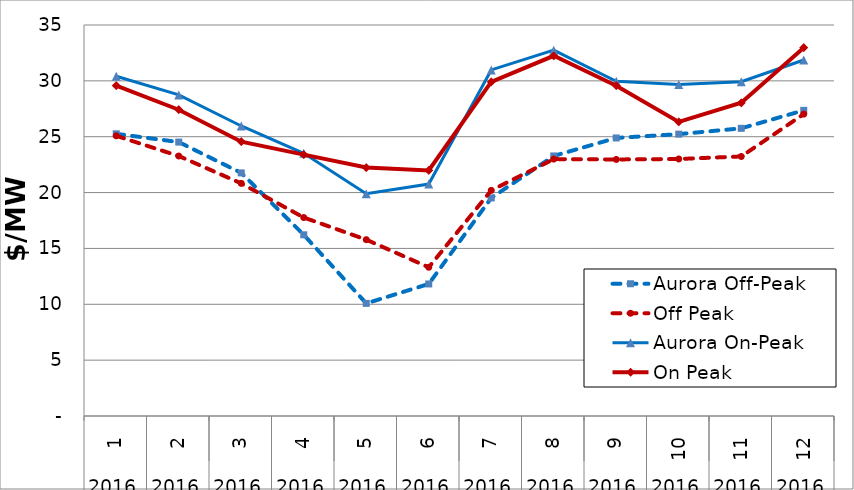
| Category | Aurora Off-Peak | Off Peak | Aurora On-Peak | On Peak |
|---|---|---|---|---|
| 0 | 25.26 | 25.08 | 30.41 | 29.564 |
| 1 | 24.52 | 23.272 | 28.74 | 27.416 |
| 2 | 21.76 | 20.823 | 25.96 | 24.552 |
| 3 | 16.22 | 17.768 | 23.51 | 23.394 |
| 4 | 10.08 | 15.785 | 19.9 | 22.239 |
| 5 | 11.82 | 13.311 | 20.76 | 21.984 |
| 6 | 19.52 | 20.197 | 30.98 | 29.917 |
| 7 | 23.28 | 22.996 | 32.75 | 32.244 |
| 8 | 24.89 | 22.965 | 29.96 | 29.567 |
| 9 | 25.23 | 23.005 | 29.68 | 26.328 |
| 10 | 25.75 | 23.233 | 29.92 | 28.039 |
| 11 | 27.36 | 27.023 | 31.87 | 32.973 |